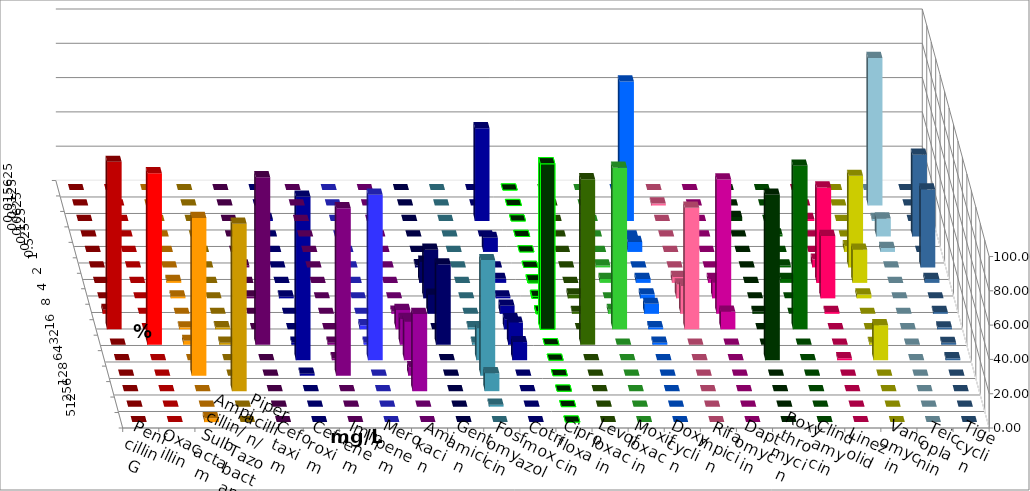
| Category | Penicillin G | Oxacillin | Ampicillin/ Sulbactam | Piperacillin/ Tazobactam | Cefotaxim | Cefuroxim | Imipenem | Meropenem | Amikacin | Gentamicin | Fosfomycin | Cotrimoxazol | Ciprofloxacin | Levofloxacin | Moxifloxacin | Doxycyclin | Rifampicin | Daptomycin | Roxythromycin | Clindamycin | Linezolid | Vancomycin | Teicoplanin | Tigecyclin |
|---|---|---|---|---|---|---|---|---|---|---|---|---|---|---|---|---|---|---|---|---|---|---|---|---|
| 0.015625 | 0 | 0 | 0 | 0 | 0 | 0 | 0 | 0 | 0 | 0 | 0 | 0 | 0 | 0 | 0 | 0 | 0 | 0 | 0 | 0 | 0 | 0 | 0 | 0 |
| 0.03125 | 0 | 0 | 0 | 0 | 0 | 0 | 0 | 0 | 0 | 0 | 0 | 0 | 0 | 0 | 0 | 0 | 1.163 | 0 | 0 | 0 | 0 | 0 | 0 | 86.047 |
| 0.0625 | 0 | 0 | 0 | 0 | 0 | 0 | 1.149 | 0 | 0 | 0 | 0 | 54.118 | 0 | 0 | 0 | 81.395 | 0 | 0 | 2.326 | 0 | 1.136 | 0 | 0 | 1.163 |
| 0.125 | 0 | 0 | 0 | 0 | 0 | 0 | 0 | 0 | 0 | 0 | 0 | 0 | 0 | 0 | 0 | 0 | 0 | 0 | 0 | 1.163 | 0 | 0 | 47.727 | 10.465 |
| 0.25 | 0 | 0 | 0 | 0 | 0 | 0 | 0 | 0 | 0 | 0 | 0 | 8.235 | 0 | 0 | 0 | 5.814 | 0 | 0 | 0 | 0 | 0 | 3.409 | 0 | 2.326 |
| 0.5 | 0 | 0 | 0 | 0 | 1.163 | 0 | 0 | 0 | 0 | 1.235 | 0 | 0 | 0 | 0 | 1.163 | 0 | 0 | 0 | 0 | 1.163 | 4.545 | 53.409 | 45.455 | 0 |
| 1.0 | 0 | 0 | 1.136 | 0 | 0 | 0 | 0 | 0 | 0 | 12.346 | 0 | 2.353 | 1.163 | 0 | 2.326 | 2.326 | 3.488 | 2.273 | 0 | 2.326 | 55.682 | 19.318 | 2.273 | 0 |
| 2.0 | 0 | 0 | 1.136 | 0 | 1.163 | 0 | 1.149 | 0 | 0 | 28.395 | 0 | 1.176 | 1.163 | 2.326 | 0 | 2.326 | 8.14 | 9.091 | 0 | 0 | 36.364 | 2.273 | 0 | 0 |
| 4.0 | 2.326 | 0 | 0 | 0 | 0 | 0 | 0 | 0 | 1.25 | 11.111 | 0 | 4.706 | 1.163 | 1.163 | 2.326 | 5.814 | 16.279 | 78.409 | 1.163 | 0 | 1.136 | 0 | 1.136 | 0 |
| 8.0 | 97.674 | 0 | 1.136 | 1.163 | 0 | 0 | 0 | 2.326 | 11.25 | 0 | 1.163 | 5.882 | 96.512 | 0 | 94.186 | 1.163 | 70.93 | 10.227 | 0 | 95.349 | 0 | 0 | 1.136 | 0 |
| 16.0 | 0 | 100 | 2.273 | 1.163 | 97.674 | 1.163 | 1.149 | 1.163 | 15 | 46.914 | 1.163 | 12.941 | 0 | 96.512 | 0 | 1.163 | 0 | 0 | 0 | 0 | 0 | 1.136 | 1.136 | 0 |
| 32.0 | 0 | 0 | 0 | 0 | 0 | 1.163 | 95.402 | 96.512 | 22.5 | 0 | 18.605 | 10.588 | 0 | 0 | 0 | 0 | 0 | 0 | 96.512 | 0 | 1.136 | 20.455 | 1.136 | 0 |
| 64.0 | 0 | 0 | 92.045 | 0 | 0 | 97.674 | 1.149 | 0 | 5 | 0 | 67.442 | 0 | 0 | 0 | 0 | 0 | 0 | 0 | 0 | 0 | 0 | 0 | 0 | 0 |
| 128.0 | 0 | 0 | 0 | 97.674 | 0 | 0 | 0 | 0 | 45 | 0 | 10.465 | 0 | 0 | 0 | 0 | 0 | 0 | 0 | 0 | 0 | 0 | 0 | 0 | 0 |
| 256.0 | 0 | 0 | 0 | 0 | 0 | 0 | 0 | 0 | 0 | 0 | 1.163 | 0 | 0 | 0 | 0 | 0 | 0 | 0 | 0 | 0 | 0 | 0 | 0 | 0 |
| 512.0 | 0 | 0 | 2.273 | 0 | 0 | 0 | 0 | 0 | 0 | 0 | 0 | 0 | 0 | 0 | 0 | 0 | 0 | 0 | 0 | 0 | 0 | 0 | 0 | 0 |